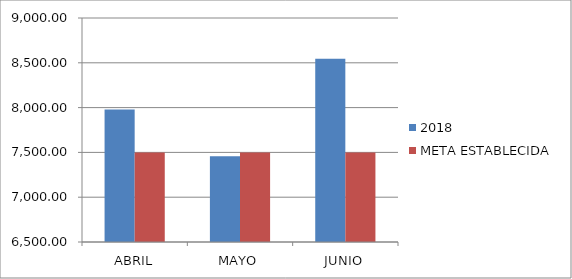
| Category | 2018 | META ESTABLECIDA |
|---|---|---|
| ABRIL | 7979.63 | 7500 |
| MAYO | 7458.06 | 7500 |
| JUNIO | 8545.23 | 7500 |